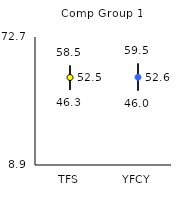
| Category | 25th | 75th | Mean |
|---|---|---|---|
| TFS | 46.3 | 58.5 | 52.52 |
| YFCY | 46 | 59.5 | 52.62 |